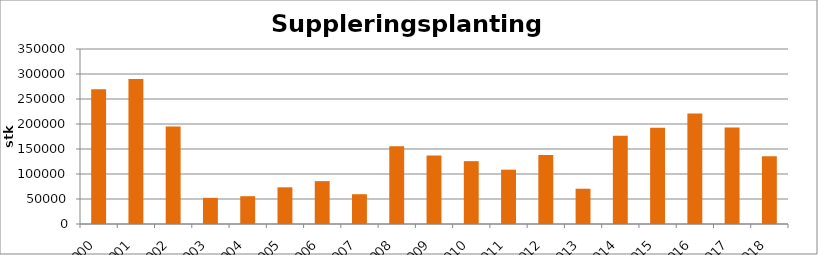
| Category | Totalt |
|---|---|
| 2000 | 269255 |
| 2001 | 289831 |
| 2002 | 194870 |
| 2003 | 52281 |
| 2004 | 55585 |
| 2005 | 73356 |
| 2006 | 85695 |
| 2007 | 59560 |
| 2008 | 155615 |
| 2009 | 136930 |
| 2010 | 125694 |
| 2011 | 108665 |
| 2012 | 137945 |
| 2013 | 70550 |
| 2014 | 176475 |
| 2015 | 192690 |
| 2016 | 220800 |
| 2017 | 193045 |
| 2018 | 135490 |